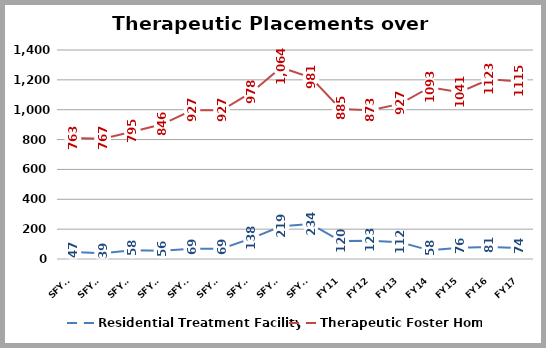
| Category | Residential Treatment Facility | Therapeutic Foster Home |
|---|---|---|
| SFY00 | 47 | 763 |
| SFY01 | 39 | 767 |
| SFY02 | 58 | 795 |
| SFY03 | 56 | 846 |
| SFY04 | 69 | 927 |
| SFY04 | 69 | 927 |
| SFY06 | 138 | 978 |
| SFY09 | 219 | 1064 |
| SFY10 | 234 | 981 |
| FY11 | 120 | 885 |
| FY12 | 123 | 873 |
| FY13 | 112 | 927 |
| FY14 | 58 | 1093 |
| FY15 | 76 | 1041 |
| FY16 | 81 | 1123 |
| FY17 | 74 | 1115 |